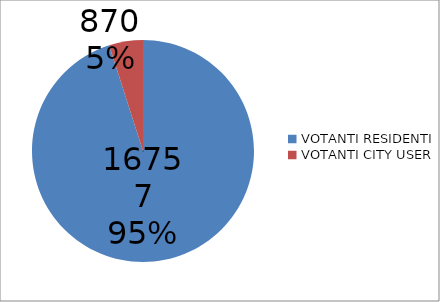
| Category | Series 0 |
|---|---|
| VOTANTI RESIDENTI | 16757 |
| VOTANTI CITY USER | 870 |